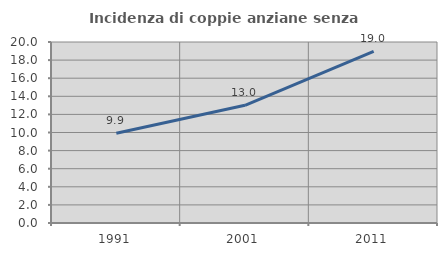
| Category | Incidenza di coppie anziane senza figli  |
|---|---|
| 1991.0 | 9.914 |
| 2001.0 | 13.003 |
| 2011.0 | 18.976 |